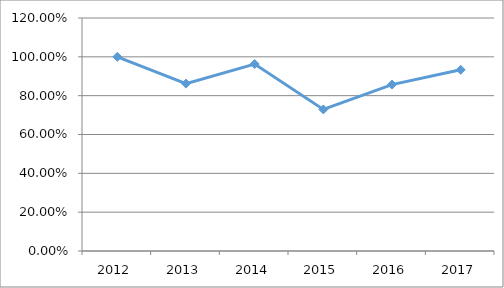
| Category | ELEC-K4O09 |
|---|---|
| 2012.0 | 1 |
| 2013.0 | 0.862 |
| 2014.0 | 0.963 |
| 2015.0 | 0.729 |
| 2016.0 | 0.857 |
| 2017.0 | 0.933 |